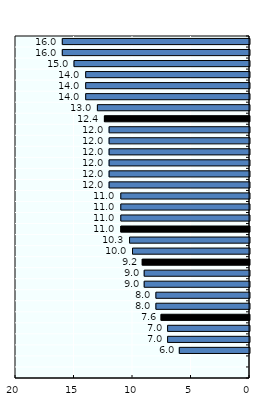
| Category | Preterm birth (per 100 live births), 2010 |
|---|---|
| Japan | 16 |
| Hong Kong, China | 16 |
| Singapore | 15 |
| Australia | 14 |
| Korea, Rep. | 14 |
| New Zealand | 14 |
| Asia Pacific-H | 13 |
| Macau, China | 12.4 |
| OECD | 12 |
| Brunei Darussalam | 12 |
| China | 12 |
| Viet Nam | 12 |
| Thailand | 12 |
| Malaysia | 12 |
| Sri Lanka | 11 |
| Asia Pacific-UM | 11 |
| Bangladesh | 11 |
| Nepal | 11 |
| Solomon Islands | 10.25 |
| Korea, DPR | 10 |
| Fiji | 9.167 |
| Mongolia | 9 |
| Cambodia | 9 |
| Indonesia | 8 |
| Asia Pacific-LM/L | 8 |
| Philippines | 7.558 |
| India | 7 |
| Myanmar | 7 |
| Pakistan | 6 |
| Papua New Guinea | 0 |
| Lao PDR | 0 |